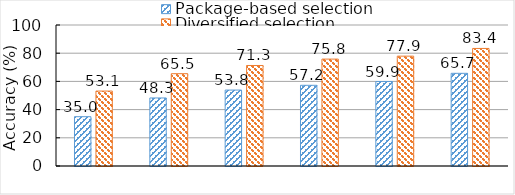
| Category | Package-based selection | Diversified selection |
|---|---|---|
| 0 | 34.965 | 53.14 |
| 1 | 48.252 | 65.465 |
| 2 | 53.846 | 71.279 |
| 3 | 57.226 | 75.814 |
| 4 | 59.907 | 77.907 |
| 5 | 65.734 | 83.372 |